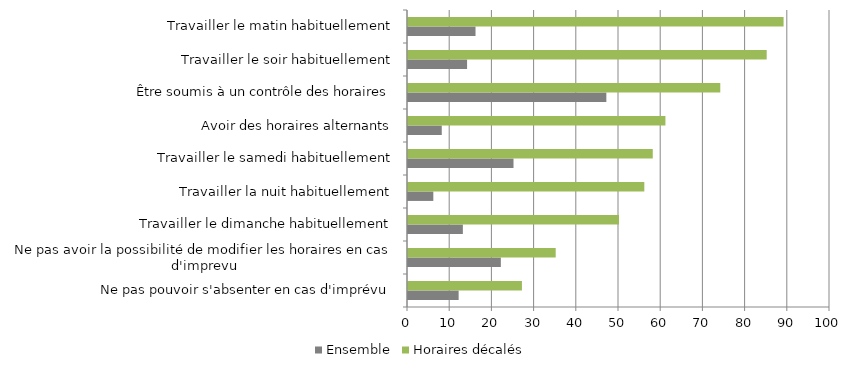
| Category | Ensemble | Horaires décalés |
|---|---|---|
| Ne pas pouvoir s'absenter en cas d'imprévu | 12 | 27 |
| Ne pas avoir la possibilité de modifier les horaires en cas d'imprevu | 22 | 35 |
| Travailler le dimanche habituellement | 13 | 50 |
| Travailler la nuit habituellement | 6 | 56 |
| Travailler le samedi habituellement | 25 | 58 |
| Avoir des horaires alternants | 8 | 61 |
| Être soumis à un contrôle des horaires | 47 | 74 |
| Travailler le soir habituellement | 14 | 85 |
| Travailler le matin habituellement | 16 | 89 |